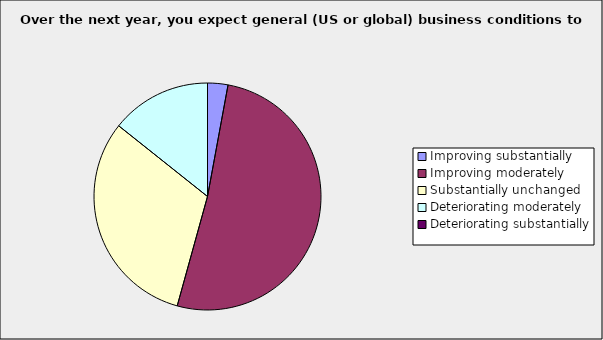
| Category | Series 0 |
|---|---|
| Improving substantially | 0.029 |
| Improving moderately | 0.514 |
| Substantially unchanged | 0.314 |
| Deteriorating moderately | 0.143 |
| Deteriorating substantially | 0 |